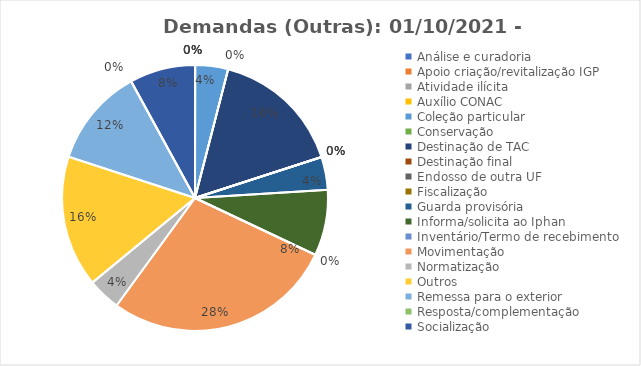
| Category | Saída |
|---|---|
| Análise e curadoria | 0 |
| Apoio criação/revitalização IGP | 0 |
| Atividade ilícita | 0 |
| Auxílio CONAC | 0 |
| Coleção particular | 1 |
| Conservação | 0 |
| Destinação de TAC | 4 |
| Destinação final | 0 |
| Endosso de outra UF | 0 |
| Fiscalização  | 0 |
| Guarda provisória | 1 |
| Informa/solicita ao Iphan | 2 |
| Inventário/Termo de recebimento | 0 |
| Movimentação | 7 |
| Normatização  | 1 |
| Outros | 4 |
| Remessa para o exterior | 3 |
| Resposta/complementação | 0 |
| Socialização | 2 |